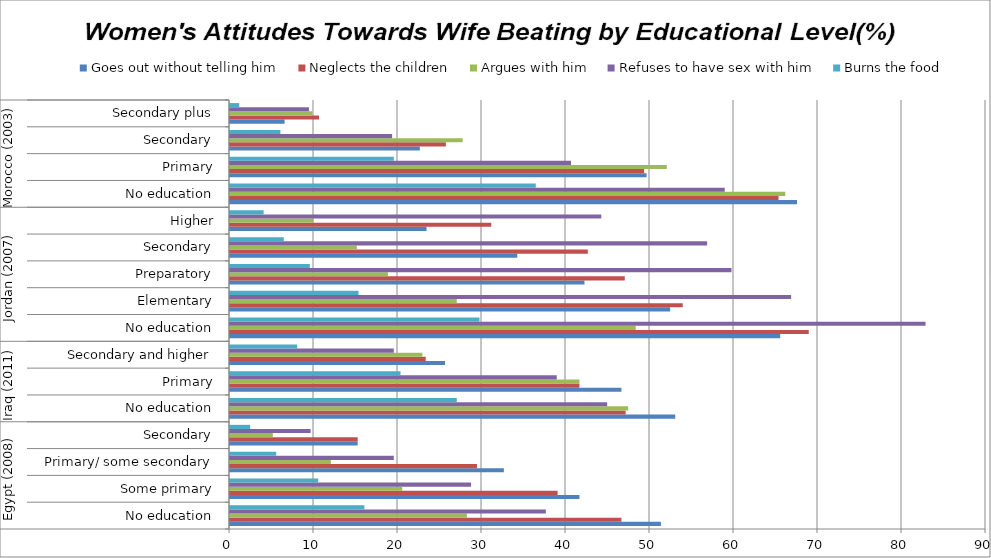
| Category | Goes out without telling him  | Neglects the children  | Argues with him  | Refuses to have sex with him  | Burns the food |
|---|---|---|---|---|---|
| 0 | 51.3 | 46.6 | 28.2 | 37.6 | 16 |
| 1 | 41.6 | 39 | 20.5 | 28.7 | 10.5 |
| 2 | 32.6 | 29.4 | 12 | 19.5 | 5.5 |
| 3 | 15.2 | 15.2 | 5.1 | 9.6 | 2.4 |
| 4 | 53 | 47.1 | 47.4 | 44.9 | 27 |
| 5 | 46.6 | 41.6 | 41.6 | 38.9 | 20.3 |
| 6 | 25.6 | 23.3 | 22.9 | 19.5 | 8 |
| 7 | 65.5 | 68.9 | 48.3 | 82.8 | 29.7 |
| 8 | 52.4 | 53.9 | 27 | 66.8 | 15.3 |
| 9 | 42.2 | 47 | 18.8 | 59.7 | 9.5 |
| 10 | 34.2 | 42.6 | 15.1 | 56.8 | 6.4 |
| 11 | 23.4 | 31.1 | 9.9 | 44.2 | 4 |
| 12 | 67.5 | 65.3 | 66.1 | 58.9 | 36.4 |
| 13 | 49.6 | 49.3 | 52 | 40.6 | 19.5 |
| 14 | 22.6 | 25.7 | 27.7 | 19.3 | 6 |
| 15 | 6.5 | 10.6 | 9.8 | 9.4 | 1.1 |